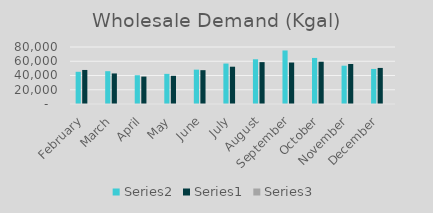
| Category | Series 1 | Series 0 | Series 2 |
|---|---|---|---|
| February | 45213 | 47777 | 0.946 |
| March | 46053 | 42881 | 1.074 |
| April | 40390 | 38510 | 1.049 |
| May | 42282 | 39535 | 1.069 |
| June | 48210 | 47488 | 1.015 |
| July | 56754 | 52336 | 1.084 |
| August | 62781 | 58778 | 1.068 |
| September | 75127 | 58188 | 1.291 |
| October | 64642 | 59318 | 1.09 |
| November | 53753 | 56106 | 0.958 |
| December | 49227 | 50621 | 0.972 |